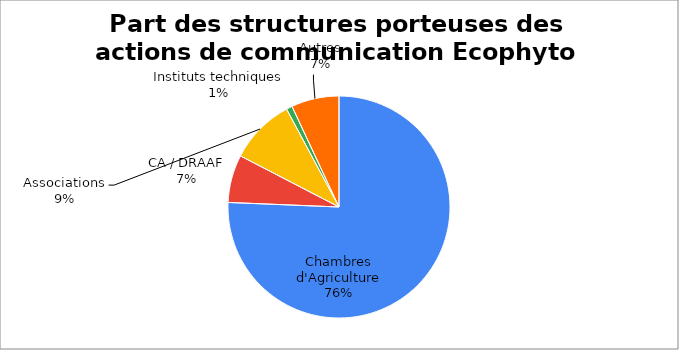
| Category | Part des structures porteuses des actions de communication Ecophyto 2022 |
|---|---|
| Chambres d'Agriculture | 87 |
| CA / DRAAF | 8 |
| Associations | 11 |
| Instituts techniques | 1 |
| Autres | 8 |